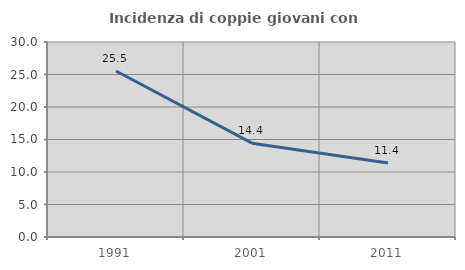
| Category | Incidenza di coppie giovani con figli |
|---|---|
| 1991.0 | 25.538 |
| 2001.0 | 14.437 |
| 2011.0 | 11.4 |